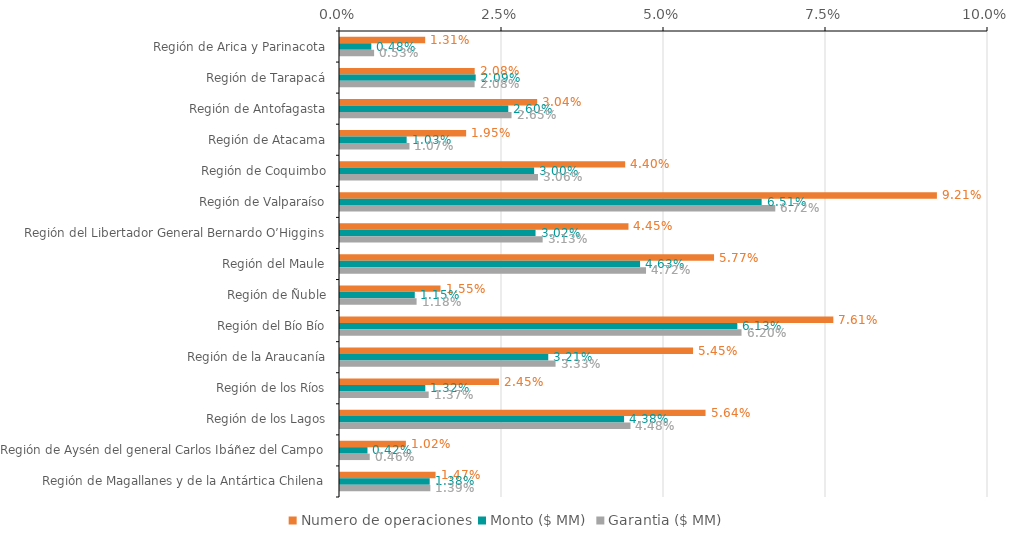
| Category | Numero de operaciones | Monto ($ MM) | Garantia ($ MM) |
|---|---|---|---|
| Región de Arica y Parinacota | 0.013 | 0.005 | 0.005 |
| Región de Tarapacá | 0.021 | 0.021 | 0.021 |
| Región de Antofagasta | 0.03 | 0.026 | 0.026 |
| Región de Atacama | 0.019 | 0.01 | 0.011 |
| Región de Coquimbo | 0.044 | 0.03 | 0.031 |
| Región de Valparaíso | 0.092 | 0.065 | 0.067 |
| Región del Libertador General Bernardo O’Higgins | 0.045 | 0.03 | 0.031 |
| Región del Maule | 0.058 | 0.046 | 0.047 |
| Región de Ñuble | 0.016 | 0.012 | 0.012 |
| Región del Bío Bío | 0.076 | 0.061 | 0.062 |
| Región de la Araucanía | 0.054 | 0.032 | 0.033 |
| Región de los Ríos | 0.025 | 0.013 | 0.014 |
| Región de los Lagos | 0.056 | 0.044 | 0.045 |
| Región de Aysén del general Carlos Ibáñez del Campo | 0.01 | 0.004 | 0.005 |
| Región de Magallanes y de la Antártica Chilena | 0.015 | 0.014 | 0.014 |